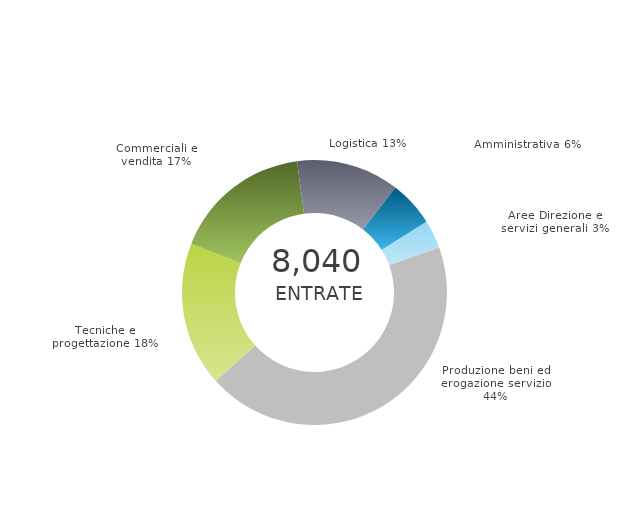
| Category | Series 0 | Series 1 |
|---|---|---|
| Produzione beni ed erogazione servizio | 0 | 0.439 |
| Tecniche e progettazione | 0 | 0.176 |
| Commerciali e vendita | 0 | 0.169 |
| Logistica | 0 | 0.125 |
| Amministrativa | 0 | 0.056 |
| Aree Direzione e servizi generali | 0 | 0.034 |